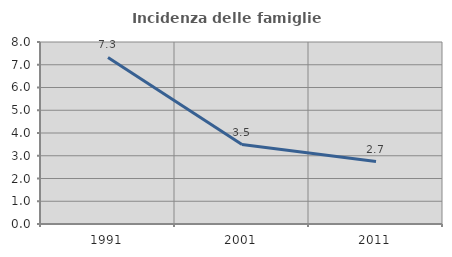
| Category | Incidenza delle famiglie numerose |
|---|---|
| 1991.0 | 7.322 |
| 2001.0 | 3.493 |
| 2011.0 | 2.744 |